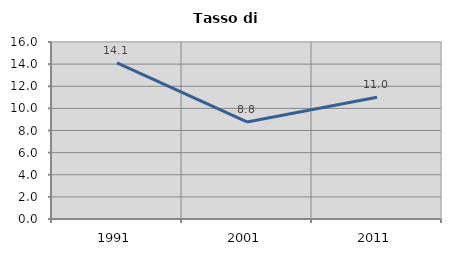
| Category | Tasso di disoccupazione   |
|---|---|
| 1991.0 | 14.105 |
| 2001.0 | 8.776 |
| 2011.0 | 11.002 |